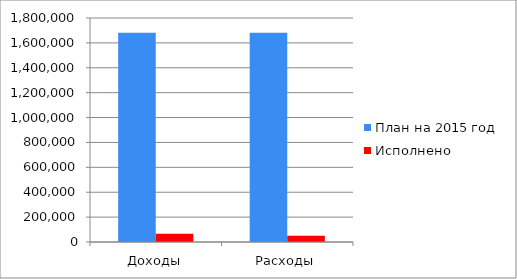
| Category | План на 2015 год | Исполнено  |
|---|---|---|
| Доходы | 1682268 | 66603 |
| Расходы | 1682268 | 50511 |